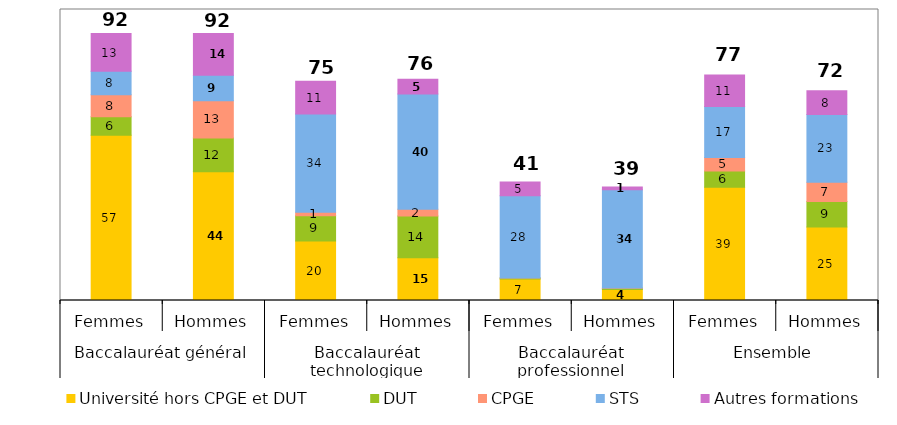
| Category | Université hors CPGE et DUT | DUT | CPGE | STS | Autres formations |
|---|---|---|---|---|---|
| 0 | 56.775 | 6.368 | 7.546 | 8.086 | 13.006 |
| 1 | 44.268 | 11.541 | 12.859 | 8.729 | 14.318 |
| 2 | 20.41 | 8.702 | 1.173 | 33.838 | 11.241 |
| 3 | 14.717 | 14.3 | 2.317 | 39.629 | 5.065 |
| 4 | 7.372 | 0.34 | 0.032 | 28.269 | 4.719 |
| 5 | 3.797 | 0.37 | 0.093 | 33.829 | 0.929 |
| 6 | 38.948 | 5.513 | 4.671 | 17.494 | 10.861 |
| 7 | 25.295 | 8.712 | 6.605 | 23.269 | 8.157 |